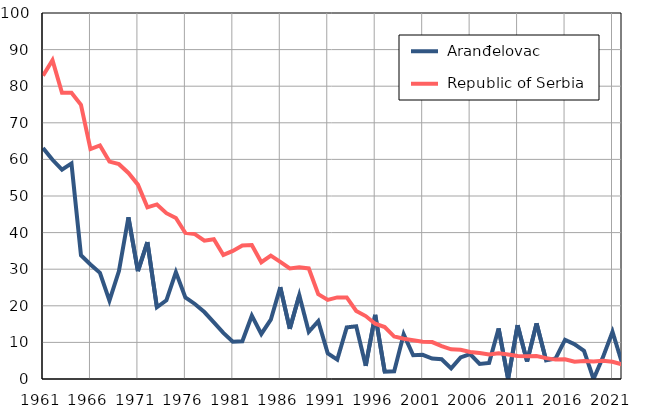
| Category |  Aranđelovac |  Republic of Serbia |
|---|---|---|
| 1961.0 | 63.1 | 82.9 |
| 1962.0 | 59.9 | 87.1 |
| 1963.0 | 57.2 | 78.2 |
| 1964.0 | 58.9 | 78.2 |
| 1965.0 | 33.8 | 74.9 |
| 1966.0 | 31.3 | 62.8 |
| 1967.0 | 29 | 63.8 |
| 1968.0 | 21.4 | 59.4 |
| 1969.0 | 29.5 | 58.7 |
| 1970.0 | 44.2 | 56.3 |
| 1971.0 | 29.5 | 53.1 |
| 1972.0 | 37.4 | 46.9 |
| 1973.0 | 19.6 | 47.7 |
| 1974.0 | 21.5 | 45.3 |
| 1975.0 | 29.2 | 44 |
| 1976.0 | 22.3 | 39.9 |
| 1977.0 | 20.5 | 39.6 |
| 1978.0 | 18.3 | 37.8 |
| 1979.0 | 15.5 | 38.2 |
| 1980.0 | 12.6 | 33.9 |
| 1981.0 | 10.2 | 35 |
| 1982.0 | 10.3 | 36.5 |
| 1983.0 | 17.3 | 36.6 |
| 1984.0 | 12.3 | 31.9 |
| 1985.0 | 16.2 | 33.7 |
| 1986.0 | 25.1 | 32 |
| 1987.0 | 13.7 | 30.2 |
| 1988.0 | 22.9 | 30.5 |
| 1989.0 | 12.9 | 30.2 |
| 1990.0 | 15.8 | 23.2 |
| 1991.0 | 7 | 21.6 |
| 1992.0 | 5.3 | 22.3 |
| 1993.0 | 14.1 | 22.3 |
| 1994.0 | 14.4 | 18.6 |
| 1995.0 | 3.6 | 17.2 |
| 1996.0 | 17.5 | 15.1 |
| 1997.0 | 2 | 14.2 |
| 1998.0 | 2.1 | 11.6 |
| 1999.0 | 12.2 | 11 |
| 2000.0 | 6.5 | 10.6 |
| 2001.0 | 6.6 | 10.2 |
| 2002.0 | 5.6 | 10.1 |
| 2003.0 | 5.4 | 9 |
| 2004.0 | 2.9 | 8.1 |
| 2005.0 | 5.9 | 8 |
| 2006.0 | 6.8 | 7.4 |
| 2007.0 | 4.1 | 7.1 |
| 2008.0 | 4.4 | 6.7 |
| 2009.0 | 13.8 | 7 |
| 2010.0 | 0 | 6.7 |
| 2011.0 | 14.7 | 6.3 |
| 2012.0 | 4.8 | 6.2 |
| 2013.0 | 15.2 | 6.3 |
| 2014.0 | 5.1 | 5.7 |
| 2015.0 | 5.6 | 5.3 |
| 2016.0 | 10.7 | 5.4 |
| 2017.0 | 9.5 | 4.7 |
| 2018.0 | 7.7 | 4.9 |
| 2019.0 | 0 | 4.8 |
| 2020.0 | 6 | 5 |
| 2021.0 | 12.9 | 4.7 |
| 2022.0 | 4.4 | 4 |